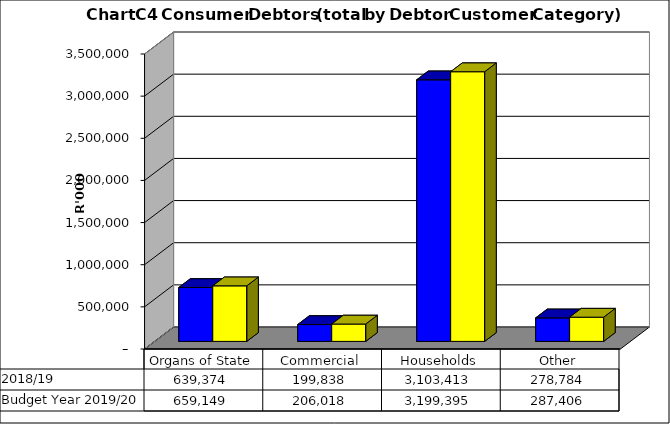
| Category |  2018/19  | Budget Year 2019/20 |
|---|---|---|
| Organs of State | 639374287.713 | 659148750.22 |
| Commercial | 199837523.729 | 206018065.7 |
| Households | 3103413163.173 | 3199395013.58 |
| Other | 278783945.101 | 287406128.97 |